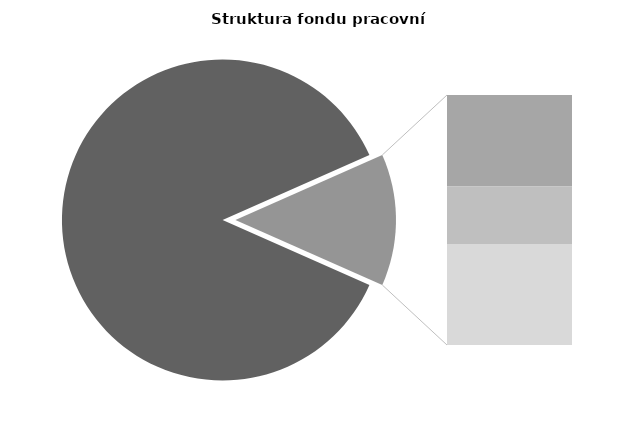
| Category | Series 0 |
|---|---|
| Průměrná měsíční 
odpracovaná doba  
bez přesčasu | 147.739 |
| Dovolená | 8.273 |
| Nemoc | 5.184 |
| Jiné | 9.129 |